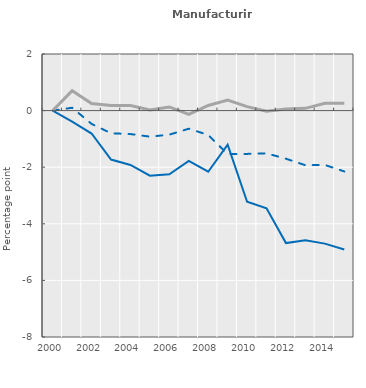
| Category | Job reallocation rate | Entry rate | Exit rate |
|---|---|---|---|
| 2000.0 | 0 | 0 | 0 |
| 2001.0 | -0.39 | 0.1 | 0.7 |
| 2002.0 | -0.81 | -0.47 | 0.25 |
| 2003.0 | -1.73 | -0.8 | 0.18 |
| 2004.0 | -1.92 | -0.83 | 0.18 |
| 2005.0 | -2.3 | -0.92 | 0.02 |
| 2006.0 | -2.25 | -0.85 | 0.13 |
| 2007.0 | -1.78 | -0.64 | -0.13 |
| 2008.0 | -2.16 | -0.86 | 0.18 |
| 2009.0 | -1.2 | -1.54 | 0.37 |
| 2010.0 | -3.22 | -1.53 | 0.14 |
| 2011.0 | -3.45 | -1.51 | -0.02 |
| 2012.0 | -4.68 | -1.7 | 0.06 |
| 2013.0 | -4.58 | -1.93 | 0.08 |
| 2014.0 | -4.7 | -1.92 | 0.26 |
| 2015.0 | -4.91 | -2.15 | 0.26 |